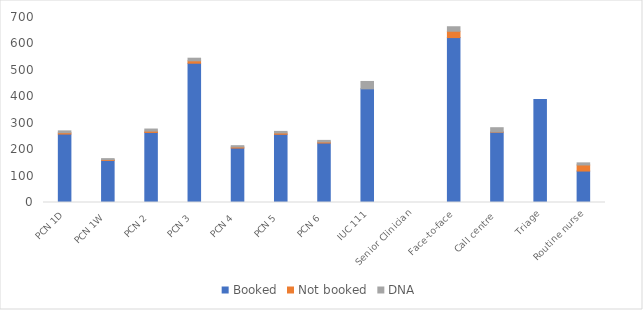
| Category | Booked | Not booked | DNA |
|---|---|---|---|
| PCN 1D | 259 | 5 | 7 |
| PCN 1W | 159 | 3 | 4 |
| PCN 2 | 265 | 5 | 8 |
| PCN 3 | 527 | 9 | 10 |
| PCN 4 | 206 | 4 | 5 |
| PCN 5 | 258 | 5 | 6 |
| PCN 6 | 225 | 4 | 6 |
| IUC 111 | 430 | 0 | 28 |
| Senior Clinician | 0 | 0 | 0 |
| Face-to-face | 624 | 24 | 17 |
| Call centre | 266 | 1 | 16 |
| Triage | 390 | 0 | 0 |
| Routine nurse | 119 | 23 | 8 |